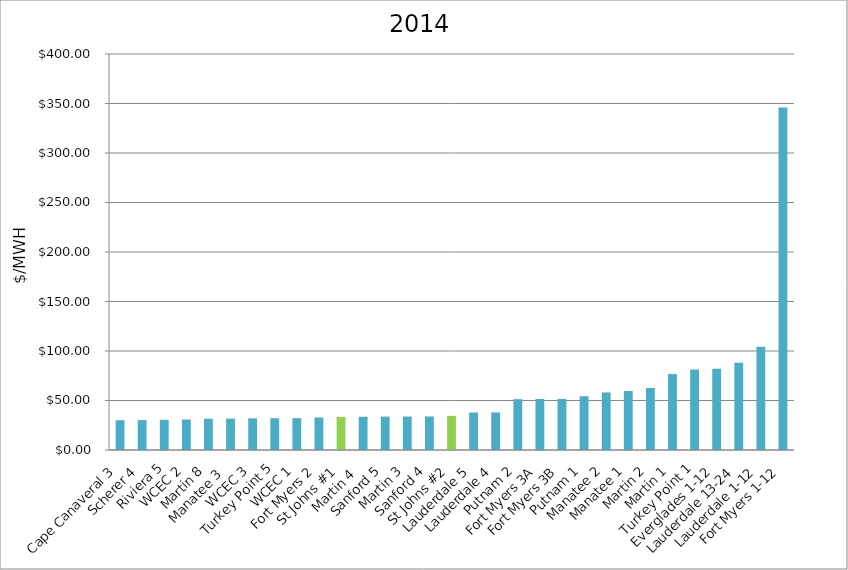
| Category | $/MWH |
|---|---|
| Cape Canaveral 3 | 30.08 |
| Scherer 4 | 30.199 |
| Riviera 5 | 30.53 |
| WCEC 2 | 30.787 |
| Martin 8 | 31.55 |
| Manatee 3  | 31.699 |
| WCEC 3 | 31.95 |
| Turkey Point 5 | 32.076 |
| WCEC 1 | 32.112 |
| Fort Myers 2 | 32.852 |
| St Johns #1 | 33.387 |
| Martin 4  | 33.576 |
| Sanford 5 | 33.722 |
| Martin 3 | 33.806 |
| Sanford 4 | 33.856 |
| St Johns #2 | 34.481 |
| Lauderdale 5 | 37.854 |
| Lauderdale 4 | 37.96 |
| Putnam 2 | 51.346 |
| Fort Myers 3A | 51.524 |
| Fort Myers 3B | 51.591 |
| Putnam 1 | 54.269 |
| Manatee 2 | 58.157 |
| Manatee 1 | 59.542 |
| Martin 2 | 62.646 |
| Martin 1 | 76.721 |
| Turkey Point 1 | 81.254 |
| Everglades 1-12 | 82.112 |
| Lauderdale 13-24 | 88.17 |
| Lauderdale 1-12 | 104.376 |
| Fort Myers 1-12 | 346.083 |